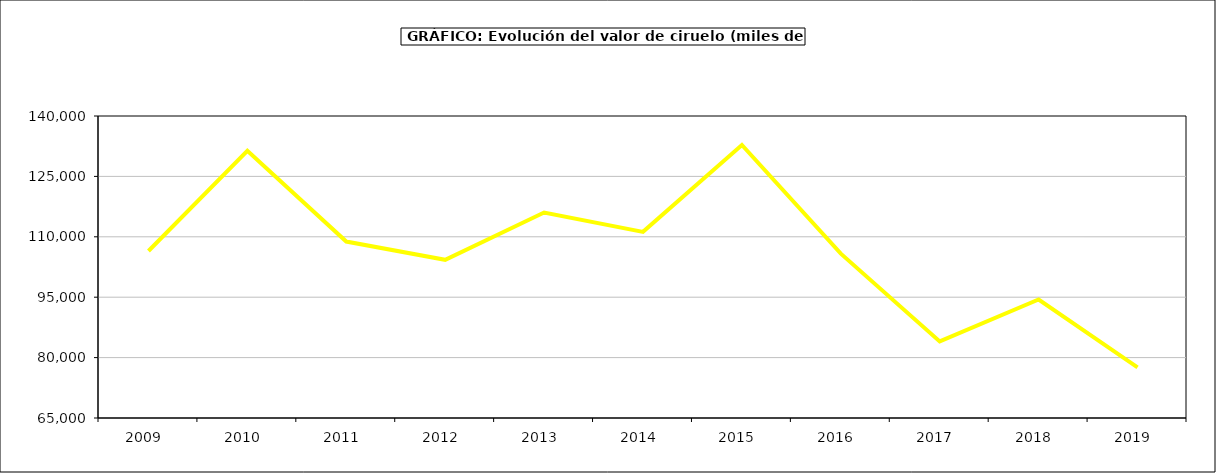
| Category | valor Ciruelo |
|---|---|
| 2009.0 | 106473.572 |
| 2010.0 | 131357.754 |
| 2011.0 | 108812.33 |
| 2012.0 | 104288.297 |
| 2013.0 | 116027.366 |
| 2014.0 | 111223.369 |
| 2015.0 | 132808 |
| 2016.0 | 105821 |
| 2017.0 | 84025.67 |
| 2018.0 | 94421.725 |
| 2019.0 | 77582.545 |